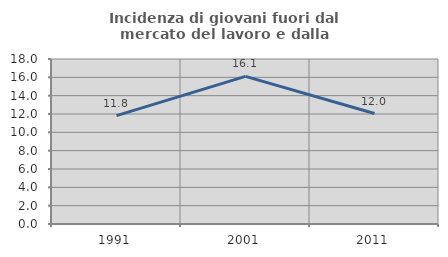
| Category | Incidenza di giovani fuori dal mercato del lavoro e dalla formazione  |
|---|---|
| 1991.0 | 11.828 |
| 2001.0 | 16.109 |
| 2011.0 | 12.048 |